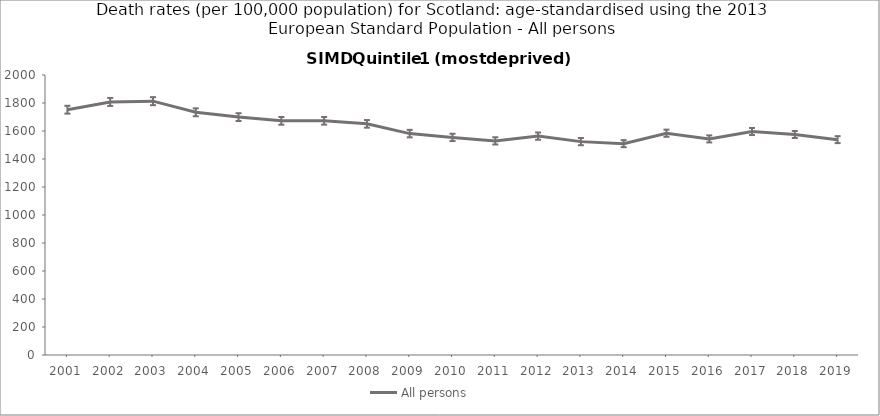
| Category | All persons |
|---|---|
| 2001.0 | 1752.1 |
| 2002.0 | 1807.6 |
| 2003.0 | 1813.1 |
| 2004.0 | 1733.6 |
| 2005.0 | 1699.2 |
| 2006.0 | 1672.4 |
| 2007.0 | 1672.8 |
| 2008.0 | 1651 |
| 2009.0 | 1581.4 |
| 2010.0 | 1554.2 |
| 2011.0 | 1529.3 |
| 2012.0 | 1563.5 |
| 2013.0 | 1524.1 |
| 2014.0 | 1509.6 |
| 2015.0 | 1584.1 |
| 2016.0 | 1543.6 |
| 2017.0 | 1596.4 |
| 2018.0 | 1575.1 |
| 2019.0 | 1538.3 |